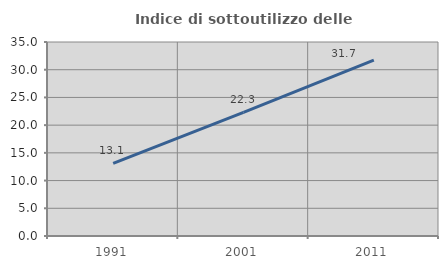
| Category | Indice di sottoutilizzo delle abitazioni  |
|---|---|
| 1991.0 | 13.106 |
| 2001.0 | 22.312 |
| 2011.0 | 31.749 |